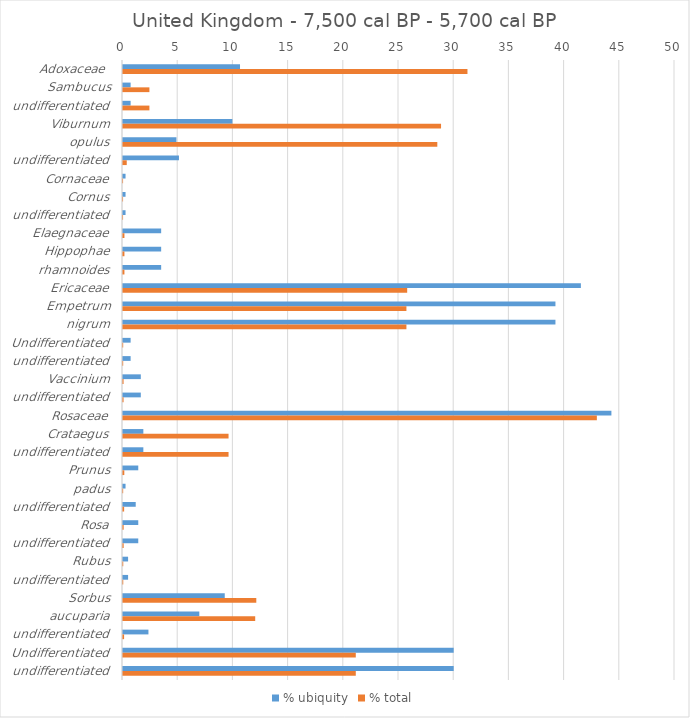
| Category | % ubiquity | % total |
|---|---|---|
| Adoxaceae  | 10.599 | 31.202 |
| Sambucus | 0.691 | 2.393 |
| undifferentiated | 0.691 | 2.393 |
| Viburnum | 9.908 | 28.809 |
| opulus | 4.839 | 28.47 |
| undifferentiated | 5.069 | 0.339 |
| Cornaceae | 0.23 | 0.006 |
| Cornus | 0.23 | 0.006 |
| undifferentiated | 0.23 | 0.006 |
| Elaegnaceae | 3.456 | 0.129 |
| Hippophae | 3.456 | 0.129 |
| rhamnoides | 3.456 | 0.129 |
| Ericaceae | 41.475 | 25.741 |
| Empetrum | 39.171 | 25.672 |
| nigrum | 39.171 | 25.672 |
| Undifferentiated | 0.691 | 0.017 |
| undifferentiated | 0.691 | 0.017 |
| Vaccinium | 1.613 | 0.052 |
| undifferentiated | 1.613 | 0.052 |
| Rosaceae | 44.24 | 42.921 |
| Crataegus | 1.843 | 9.56 |
| undifferentiated | 1.843 | 9.56 |
| Prunus | 1.382 | 0.118 |
| padus | 0.23 | 0.015 |
| undifferentiated | 1.152 | 0.103 |
| Rosa | 1.382 | 0.06 |
| undifferentiated | 1.382 | 0.06 |
| Rubus | 0.461 | 0.023 |
| undifferentiated | 0.461 | 0.023 |
| Sorbus | 9.217 | 12.074 |
| aucuparia | 6.912 | 11.975 |
| undifferentiated | 2.304 | 0.099 |
| Undifferentiated | 29.954 | 21.086 |
| undifferentiated | 29.954 | 21.086 |